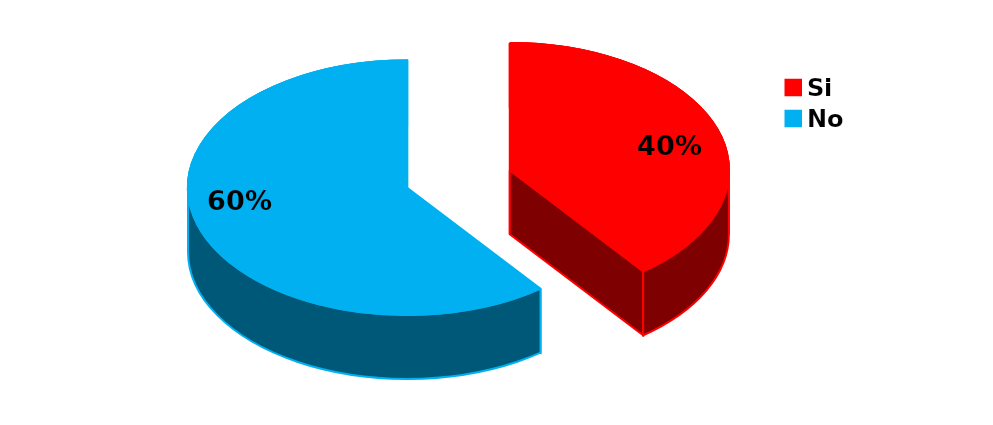
| Category | Series 0 |
|---|---|
| Si | 19 |
| No | 29 |